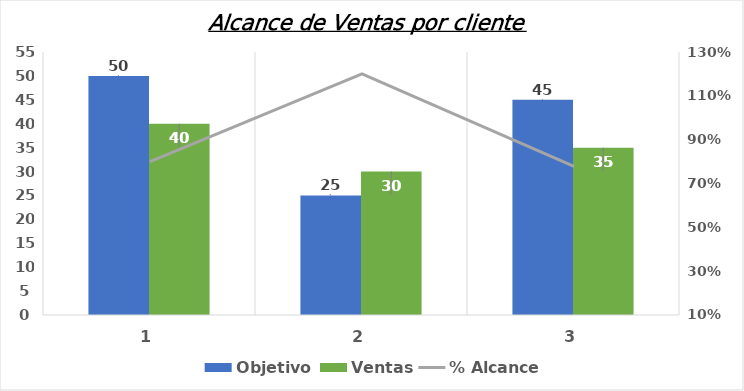
| Category | Objetivo  | Ventas |
|---|---|---|
| 0 | 50 | 40 |
| 1 | 25 | 30 |
| 2 | 45 | 35 |